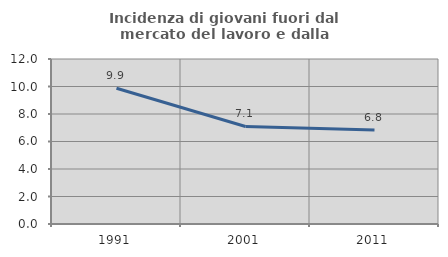
| Category | Incidenza di giovani fuori dal mercato del lavoro e dalla formazione  |
|---|---|
| 1991.0 | 9.873 |
| 2001.0 | 7.092 |
| 2011.0 | 6.835 |